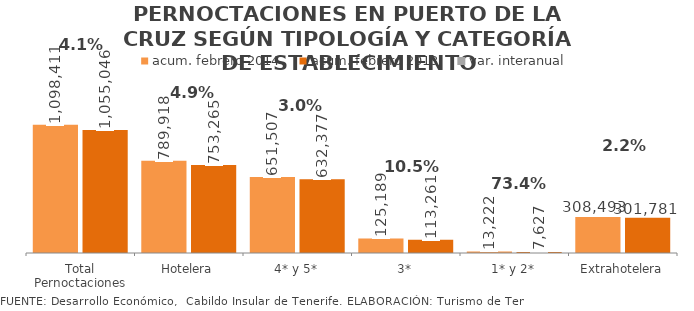
| Category | acum. febrero 2014 | acum. febrero 2013 |
|---|---|---|
| Total Pernoctaciones | 1098411 | 1055046 |
| Hotelera | 789918 | 753265 |
| 4* y 5* | 651507 | 632377 |
| 3* | 125189 | 113261 |
| 1* y 2* | 13222 | 7627 |
| Extrahotelera | 308493 | 301781 |